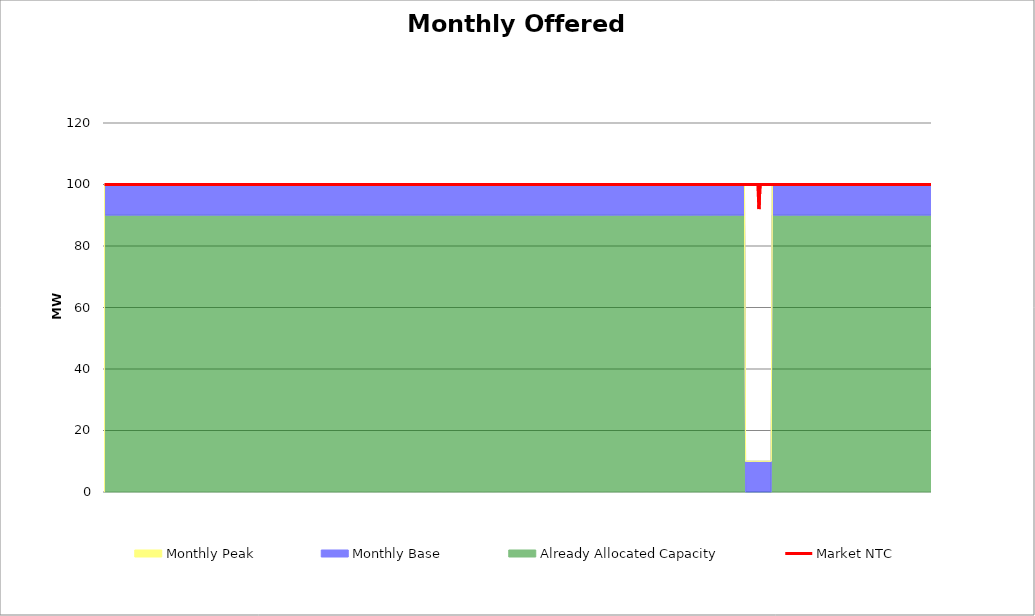
| Category | Market NTC |
|---|---|
| 0 | 100 |
| 1 | 100 |
| 2 | 100 |
| 3 | 100 |
| 4 | 100 |
| 5 | 100 |
| 6 | 100 |
| 7 | 100 |
| 8 | 100 |
| 9 | 100 |
| 10 | 100 |
| 11 | 100 |
| 12 | 100 |
| 13 | 100 |
| 14 | 100 |
| 15 | 100 |
| 16 | 100 |
| 17 | 100 |
| 18 | 100 |
| 19 | 100 |
| 20 | 100 |
| 21 | 100 |
| 22 | 100 |
| 23 | 100 |
| 24 | 100 |
| 25 | 100 |
| 26 | 100 |
| 27 | 100 |
| 28 | 100 |
| 29 | 100 |
| 30 | 100 |
| 31 | 100 |
| 32 | 100 |
| 33 | 100 |
| 34 | 100 |
| 35 | 100 |
| 36 | 100 |
| 37 | 100 |
| 38 | 100 |
| 39 | 100 |
| 40 | 100 |
| 41 | 100 |
| 42 | 100 |
| 43 | 100 |
| 44 | 100 |
| 45 | 100 |
| 46 | 100 |
| 47 | 100 |
| 48 | 100 |
| 49 | 100 |
| 50 | 100 |
| 51 | 100 |
| 52 | 100 |
| 53 | 100 |
| 54 | 100 |
| 55 | 100 |
| 56 | 100 |
| 57 | 100 |
| 58 | 100 |
| 59 | 100 |
| 60 | 100 |
| 61 | 100 |
| 62 | 100 |
| 63 | 100 |
| 64 | 100 |
| 65 | 100 |
| 66 | 100 |
| 67 | 100 |
| 68 | 100 |
| 69 | 100 |
| 70 | 100 |
| 71 | 100 |
| 72 | 100 |
| 73 | 100 |
| 74 | 100 |
| 75 | 100 |
| 76 | 100 |
| 77 | 100 |
| 78 | 100 |
| 79 | 100 |
| 80 | 100 |
| 81 | 100 |
| 82 | 100 |
| 83 | 100 |
| 84 | 100 |
| 85 | 100 |
| 86 | 100 |
| 87 | 100 |
| 88 | 100 |
| 89 | 100 |
| 90 | 100 |
| 91 | 100 |
| 92 | 100 |
| 93 | 100 |
| 94 | 100 |
| 95 | 100 |
| 96 | 100 |
| 97 | 100 |
| 98 | 100 |
| 99 | 100 |
| 100 | 100 |
| 101 | 100 |
| 102 | 100 |
| 103 | 100 |
| 104 | 100 |
| 105 | 100 |
| 106 | 100 |
| 107 | 100 |
| 108 | 100 |
| 109 | 100 |
| 110 | 100 |
| 111 | 100 |
| 112 | 100 |
| 113 | 100 |
| 114 | 100 |
| 115 | 100 |
| 116 | 100 |
| 117 | 100 |
| 118 | 100 |
| 119 | 100 |
| 120 | 100 |
| 121 | 100 |
| 122 | 100 |
| 123 | 100 |
| 124 | 100 |
| 125 | 100 |
| 126 | 100 |
| 127 | 100 |
| 128 | 100 |
| 129 | 100 |
| 130 | 100 |
| 131 | 100 |
| 132 | 100 |
| 133 | 100 |
| 134 | 100 |
| 135 | 100 |
| 136 | 100 |
| 137 | 100 |
| 138 | 100 |
| 139 | 100 |
| 140 | 100 |
| 141 | 100 |
| 142 | 100 |
| 143 | 100 |
| 144 | 100 |
| 145 | 100 |
| 146 | 100 |
| 147 | 100 |
| 148 | 100 |
| 149 | 100 |
| 150 | 100 |
| 151 | 100 |
| 152 | 100 |
| 153 | 100 |
| 154 | 100 |
| 155 | 100 |
| 156 | 100 |
| 157 | 100 |
| 158 | 100 |
| 159 | 100 |
| 160 | 100 |
| 161 | 100 |
| 162 | 100 |
| 163 | 100 |
| 164 | 100 |
| 165 | 100 |
| 166 | 100 |
| 167 | 100 |
| 168 | 100 |
| 169 | 100 |
| 170 | 100 |
| 171 | 100 |
| 172 | 100 |
| 173 | 100 |
| 174 | 100 |
| 175 | 100 |
| 176 | 100 |
| 177 | 100 |
| 178 | 100 |
| 179 | 100 |
| 180 | 100 |
| 181 | 100 |
| 182 | 100 |
| 183 | 100 |
| 184 | 100 |
| 185 | 100 |
| 186 | 100 |
| 187 | 100 |
| 188 | 100 |
| 189 | 100 |
| 190 | 100 |
| 191 | 100 |
| 192 | 100 |
| 193 | 100 |
| 194 | 100 |
| 195 | 100 |
| 196 | 100 |
| 197 | 100 |
| 198 | 100 |
| 199 | 100 |
| 200 | 100 |
| 201 | 100 |
| 202 | 100 |
| 203 | 100 |
| 204 | 100 |
| 205 | 100 |
| 206 | 100 |
| 207 | 100 |
| 208 | 100 |
| 209 | 100 |
| 210 | 100 |
| 211 | 100 |
| 212 | 100 |
| 213 | 100 |
| 214 | 100 |
| 215 | 100 |
| 216 | 100 |
| 217 | 100 |
| 218 | 100 |
| 219 | 100 |
| 220 | 100 |
| 221 | 100 |
| 222 | 100 |
| 223 | 100 |
| 224 | 100 |
| 225 | 100 |
| 226 | 100 |
| 227 | 100 |
| 228 | 100 |
| 229 | 100 |
| 230 | 100 |
| 231 | 100 |
| 232 | 100 |
| 233 | 100 |
| 234 | 100 |
| 235 | 100 |
| 236 | 100 |
| 237 | 100 |
| 238 | 100 |
| 239 | 100 |
| 240 | 100 |
| 241 | 100 |
| 242 | 100 |
| 243 | 100 |
| 244 | 100 |
| 245 | 100 |
| 246 | 100 |
| 247 | 100 |
| 248 | 100 |
| 249 | 100 |
| 250 | 100 |
| 251 | 100 |
| 252 | 100 |
| 253 | 100 |
| 254 | 100 |
| 255 | 100 |
| 256 | 100 |
| 257 | 100 |
| 258 | 100 |
| 259 | 100 |
| 260 | 100 |
| 261 | 100 |
| 262 | 100 |
| 263 | 100 |
| 264 | 100 |
| 265 | 100 |
| 266 | 100 |
| 267 | 100 |
| 268 | 100 |
| 269 | 100 |
| 270 | 100 |
| 271 | 100 |
| 272 | 100 |
| 273 | 100 |
| 274 | 100 |
| 275 | 100 |
| 276 | 100 |
| 277 | 100 |
| 278 | 100 |
| 279 | 100 |
| 280 | 100 |
| 281 | 100 |
| 282 | 100 |
| 283 | 100 |
| 284 | 100 |
| 285 | 100 |
| 286 | 100 |
| 287 | 100 |
| 288 | 100 |
| 289 | 100 |
| 290 | 100 |
| 291 | 100 |
| 292 | 100 |
| 293 | 100 |
| 294 | 100 |
| 295 | 100 |
| 296 | 100 |
| 297 | 100 |
| 298 | 100 |
| 299 | 100 |
| 300 | 100 |
| 301 | 100 |
| 302 | 100 |
| 303 | 100 |
| 304 | 100 |
| 305 | 100 |
| 306 | 100 |
| 307 | 100 |
| 308 | 100 |
| 309 | 100 |
| 310 | 100 |
| 311 | 100 |
| 312 | 100 |
| 313 | 100 |
| 314 | 100 |
| 315 | 100 |
| 316 | 100 |
| 317 | 100 |
| 318 | 100 |
| 319 | 100 |
| 320 | 100 |
| 321 | 100 |
| 322 | 100 |
| 323 | 100 |
| 324 | 100 |
| 325 | 100 |
| 326 | 100 |
| 327 | 100 |
| 328 | 100 |
| 329 | 100 |
| 330 | 100 |
| 331 | 100 |
| 332 | 100 |
| 333 | 100 |
| 334 | 100 |
| 335 | 100 |
| 336 | 100 |
| 337 | 100 |
| 338 | 100 |
| 339 | 100 |
| 340 | 100 |
| 341 | 100 |
| 342 | 100 |
| 343 | 100 |
| 344 | 100 |
| 345 | 100 |
| 346 | 100 |
| 347 | 100 |
| 348 | 100 |
| 349 | 100 |
| 350 | 100 |
| 351 | 100 |
| 352 | 100 |
| 353 | 100 |
| 354 | 100 |
| 355 | 100 |
| 356 | 100 |
| 357 | 100 |
| 358 | 100 |
| 359 | 100 |
| 360 | 100 |
| 361 | 100 |
| 362 | 100 |
| 363 | 100 |
| 364 | 100 |
| 365 | 100 |
| 366 | 100 |
| 367 | 100 |
| 368 | 100 |
| 369 | 100 |
| 370 | 100 |
| 371 | 100 |
| 372 | 100 |
| 373 | 100 |
| 374 | 100 |
| 375 | 100 |
| 376 | 100 |
| 377 | 100 |
| 378 | 100 |
| 379 | 100 |
| 380 | 100 |
| 381 | 100 |
| 382 | 100 |
| 383 | 100 |
| 384 | 100 |
| 385 | 100 |
| 386 | 100 |
| 387 | 100 |
| 388 | 100 |
| 389 | 100 |
| 390 | 100 |
| 391 | 100 |
| 392 | 100 |
| 393 | 100 |
| 394 | 100 |
| 395 | 100 |
| 396 | 100 |
| 397 | 100 |
| 398 | 100 |
| 399 | 100 |
| 400 | 100 |
| 401 | 100 |
| 402 | 100 |
| 403 | 100 |
| 404 | 100 |
| 405 | 100 |
| 406 | 100 |
| 407 | 100 |
| 408 | 100 |
| 409 | 100 |
| 410 | 100 |
| 411 | 100 |
| 412 | 100 |
| 413 | 100 |
| 414 | 100 |
| 415 | 100 |
| 416 | 100 |
| 417 | 100 |
| 418 | 100 |
| 419 | 100 |
| 420 | 100 |
| 421 | 100 |
| 422 | 100 |
| 423 | 100 |
| 424 | 100 |
| 425 | 100 |
| 426 | 100 |
| 427 | 100 |
| 428 | 100 |
| 429 | 100 |
| 430 | 100 |
| 431 | 100 |
| 432 | 100 |
| 433 | 100 |
| 434 | 100 |
| 435 | 100 |
| 436 | 100 |
| 437 | 100 |
| 438 | 100 |
| 439 | 100 |
| 440 | 100 |
| 441 | 100 |
| 442 | 100 |
| 443 | 100 |
| 444 | 100 |
| 445 | 100 |
| 446 | 100 |
| 447 | 100 |
| 448 | 100 |
| 449 | 100 |
| 450 | 100 |
| 451 | 100 |
| 452 | 100 |
| 453 | 100 |
| 454 | 100 |
| 455 | 100 |
| 456 | 100 |
| 457 | 100 |
| 458 | 100 |
| 459 | 100 |
| 460 | 100 |
| 461 | 100 |
| 462 | 100 |
| 463 | 100 |
| 464 | 100 |
| 465 | 100 |
| 466 | 100 |
| 467 | 100 |
| 468 | 100 |
| 469 | 100 |
| 470 | 100 |
| 471 | 100 |
| 472 | 100 |
| 473 | 100 |
| 474 | 100 |
| 475 | 100 |
| 476 | 100 |
| 477 | 100 |
| 478 | 100 |
| 479 | 100 |
| 480 | 100 |
| 481 | 100 |
| 482 | 100 |
| 483 | 100 |
| 484 | 100 |
| 485 | 100 |
| 486 | 100 |
| 487 | 100 |
| 488 | 100 |
| 489 | 100 |
| 490 | 100 |
| 491 | 100 |
| 492 | 100 |
| 493 | 100 |
| 494 | 100 |
| 495 | 100 |
| 496 | 100 |
| 497 | 100 |
| 498 | 100 |
| 499 | 100 |
| 500 | 100 |
| 501 | 100 |
| 502 | 100 |
| 503 | 100 |
| 504 | 100 |
| 505 | 100 |
| 506 | 100 |
| 507 | 100 |
| 508 | 100 |
| 509 | 100 |
| 510 | 100 |
| 511 | 100 |
| 512 | 100 |
| 513 | 100 |
| 514 | 100 |
| 515 | 100 |
| 516 | 100 |
| 517 | 100 |
| 518 | 100 |
| 519 | 100 |
| 520 | 100 |
| 521 | 100 |
| 522 | 100 |
| 523 | 100 |
| 524 | 100 |
| 525 | 100 |
| 526 | 100 |
| 527 | 100 |
| 528 | 100 |
| 529 | 100 |
| 530 | 100 |
| 531 | 100 |
| 532 | 100 |
| 533 | 100 |
| 534 | 100 |
| 535 | 100 |
| 536 | 100 |
| 537 | 100 |
| 538 | 100 |
| 539 | 100 |
| 540 | 100 |
| 541 | 100 |
| 542 | 100 |
| 543 | 100 |
| 544 | 100 |
| 545 | 100 |
| 546 | 100 |
| 547 | 100 |
| 548 | 100 |
| 549 | 100 |
| 550 | 100 |
| 551 | 100 |
| 552 | 100 |
| 553 | 100 |
| 554 | 100 |
| 555 | 100 |
| 556 | 100 |
| 557 | 100 |
| 558 | 100 |
| 559 | 100 |
| 560 | 100 |
| 561 | 100 |
| 562 | 100 |
| 563 | 100 |
| 564 | 100 |
| 565 | 100 |
| 566 | 100 |
| 567 | 100 |
| 568 | 100 |
| 569 | 100 |
| 570 | 100 |
| 571 | 100 |
| 572 | 100 |
| 573 | 100 |
| 574 | 100 |
| 575 | 100 |
| 576 | 100 |
| 577 | 100 |
| 578 | 100 |
| 579 | 100 |
| 580 | 100 |
| 581 | 100 |
| 582 | 100 |
| 583 | 100 |
| 584 | 100 |
| 585 | 100 |
| 586 | 100 |
| 587 | 100 |
| 588 | 92 |
| 589 | 100 |
| 590 | 100 |
| 591 | 100 |
| 592 | 100 |
| 593 | 100 |
| 594 | 100 |
| 595 | 100 |
| 596 | 100 |
| 597 | 100 |
| 598 | 100 |
| 599 | 100 |
| 600 | 100 |
| 601 | 100 |
| 602 | 100 |
| 603 | 100 |
| 604 | 100 |
| 605 | 100 |
| 606 | 100 |
| 607 | 100 |
| 608 | 100 |
| 609 | 100 |
| 610 | 100 |
| 611 | 100 |
| 612 | 100 |
| 613 | 100 |
| 614 | 100 |
| 615 | 100 |
| 616 | 100 |
| 617 | 100 |
| 618 | 100 |
| 619 | 100 |
| 620 | 100 |
| 621 | 100 |
| 622 | 100 |
| 623 | 100 |
| 624 | 100 |
| 625 | 100 |
| 626 | 100 |
| 627 | 100 |
| 628 | 100 |
| 629 | 100 |
| 630 | 100 |
| 631 | 100 |
| 632 | 100 |
| 633 | 100 |
| 634 | 100 |
| 635 | 100 |
| 636 | 100 |
| 637 | 100 |
| 638 | 100 |
| 639 | 100 |
| 640 | 100 |
| 641 | 100 |
| 642 | 100 |
| 643 | 100 |
| 644 | 100 |
| 645 | 100 |
| 646 | 100 |
| 647 | 100 |
| 648 | 100 |
| 649 | 100 |
| 650 | 100 |
| 651 | 100 |
| 652 | 100 |
| 653 | 100 |
| 654 | 100 |
| 655 | 100 |
| 656 | 100 |
| 657 | 100 |
| 658 | 100 |
| 659 | 100 |
| 660 | 100 |
| 661 | 100 |
| 662 | 100 |
| 663 | 100 |
| 664 | 100 |
| 665 | 100 |
| 666 | 100 |
| 667 | 100 |
| 668 | 100 |
| 669 | 100 |
| 670 | 100 |
| 671 | 100 |
| 672 | 100 |
| 673 | 100 |
| 674 | 100 |
| 675 | 100 |
| 676 | 100 |
| 677 | 100 |
| 678 | 100 |
| 679 | 100 |
| 680 | 100 |
| 681 | 100 |
| 682 | 100 |
| 683 | 100 |
| 684 | 100 |
| 685 | 100 |
| 686 | 100 |
| 687 | 100 |
| 688 | 100 |
| 689 | 100 |
| 690 | 100 |
| 691 | 100 |
| 692 | 100 |
| 693 | 100 |
| 694 | 100 |
| 695 | 100 |
| 696 | 100 |
| 697 | 100 |
| 698 | 100 |
| 699 | 100 |
| 700 | 100 |
| 701 | 100 |
| 702 | 100 |
| 703 | 100 |
| 704 | 100 |
| 705 | 100 |
| 706 | 100 |
| 707 | 100 |
| 708 | 100 |
| 709 | 100 |
| 710 | 100 |
| 711 | 100 |
| 712 | 100 |
| 713 | 100 |
| 714 | 100 |
| 715 | 100 |
| 716 | 100 |
| 717 | 100 |
| 718 | 100 |
| 719 | 100 |
| 720 | 100 |
| 721 | 100 |
| 722 | 100 |
| 723 | 100 |
| 724 | 100 |
| 725 | 100 |
| 726 | 100 |
| 727 | 100 |
| 728 | 100 |
| 729 | 100 |
| 730 | 100 |
| 731 | 100 |
| 732 | 100 |
| 733 | 100 |
| 734 | 100 |
| 735 | 100 |
| 736 | 100 |
| 737 | 100 |
| 738 | 100 |
| 739 | 100 |
| 740 | 100 |
| 741 | 100 |
| 742 | 100 |
| 743 | 100 |